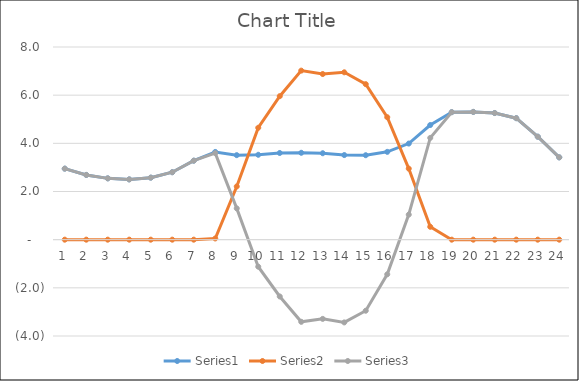
| Category | Series 0 | Series 1 | Series 2 |
|---|---|---|---|
| 0 | 2.949 | 0 | 2.949 |
| 1 | 2.688 | 0 | 2.688 |
| 2 | 2.546 | 0 | 2.546 |
| 3 | 2.503 | 0 | 2.503 |
| 4 | 2.575 | 0 | 2.575 |
| 5 | 2.801 | 0 | 2.801 |
| 6 | 3.28 | 0 | 3.28 |
| 7 | 3.642 | 0.05 | 3.593 |
| 8 | 3.509 | 2.209 | 1.299 |
| 9 | 3.525 | 4.647 | -1.122 |
| 10 | 3.599 | 5.958 | -2.359 |
| 11 | 3.607 | 7.018 | -3.411 |
| 12 | 3.588 | 6.877 | -3.289 |
| 13 | 3.513 | 6.949 | -3.436 |
| 14 | 3.507 | 6.457 | -2.95 |
| 15 | 3.646 | 5.084 | -1.438 |
| 16 | 3.99 | 2.951 | 1.04 |
| 17 | 4.761 | 0.535 | 4.226 |
| 18 | 5.293 | 0 | 5.293 |
| 19 | 5.305 | 0 | 5.305 |
| 20 | 5.258 | 0 | 5.258 |
| 21 | 5.044 | 0 | 5.044 |
| 22 | 4.276 | 0 | 4.276 |
| 23 | 3.418 | 0 | 3.418 |